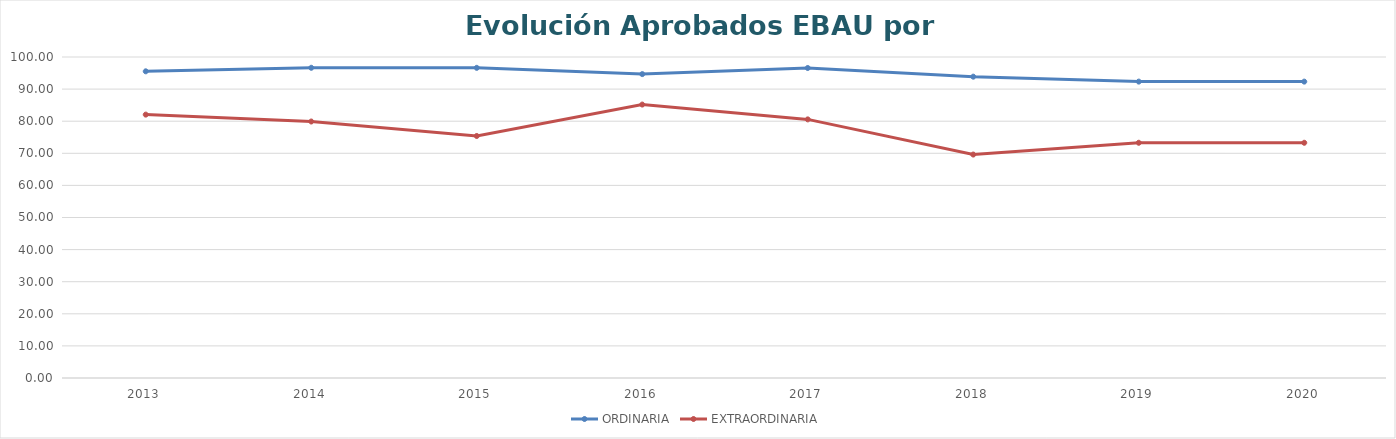
| Category | ORDINARIA | EXTRAORDINARIA |
|---|---|---|
| 2013.0 | 95.54 | 82.051 |
| 2014.0 | 96.642 | 79.903 |
| 2015.0 | 96.623 | 75.393 |
| 2016.0 | 94.672 | 85.185 |
| 2017.0 | 96.573 | 80.564 |
| 2018.0 | 93.872 | 69.61 |
| 2019.0 | 92.334 | 73.282 |
| 2020.0 | 92.33 | 73.28 |